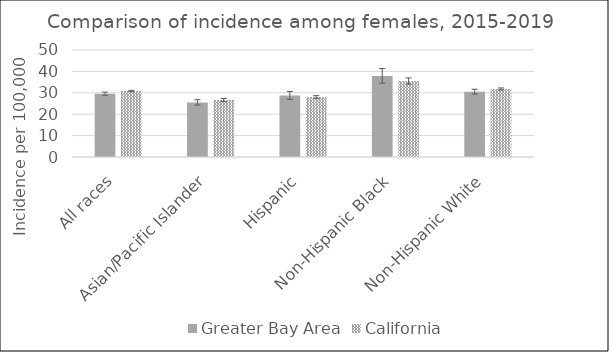
| Category | Greater Bay Area | California | SEER 18 |
|---|---|---|---|
| All races | 29.59 | 30.8 |  |
| Asian/Pacific Islander | 25.48 | 26.6 |  |
| Hispanic | 28.75 | 28.04 |  |
| Non-Hispanic Black | 37.8 | 35.48 |  |
| Non-Hispanic White | 30.54 | 31.77 |  |